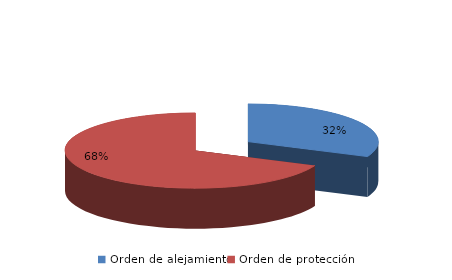
| Category | Series 0 |
|---|---|
| Orden de alejamiento | 369 |
| Orden de protección | 802 |